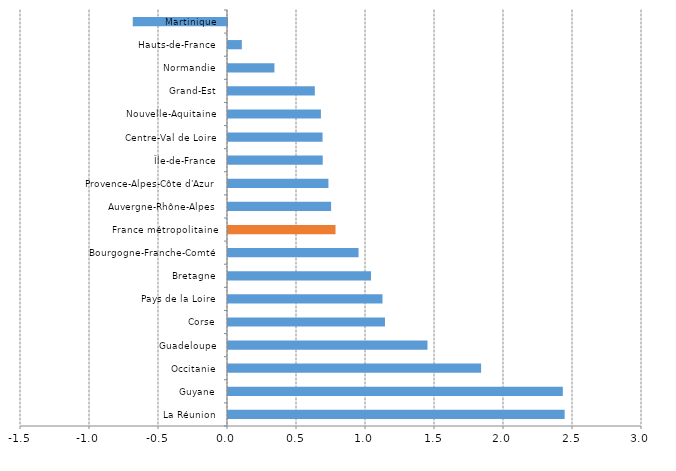
| Category | Series 0 |
|---|---|
| La Réunion | 2.44 |
| Guyane | 2.426 |
| Occitanie | 1.834 |
| Guadeloupe | 1.445 |
| Corse | 1.138 |
| Pays de la Loire | 1.12 |
| Bretagne | 1.036 |
| Bourgogne-Franche-Comté | 0.946 |
| France métropolitaine | 0.779 |
| Auvergne-Rhône-Alpes | 0.747 |
| Provence-Alpes-Côte d'Azur | 0.728 |
| Île-de-France | 0.686 |
| Centre-Val de Loire | 0.685 |
| Nouvelle-Aquitaine | 0.673 |
| Grand-Est | 0.629 |
| Normandie | 0.336 |
| Hauts-de-France | 0.1 |
| Martinique | -0.683 |